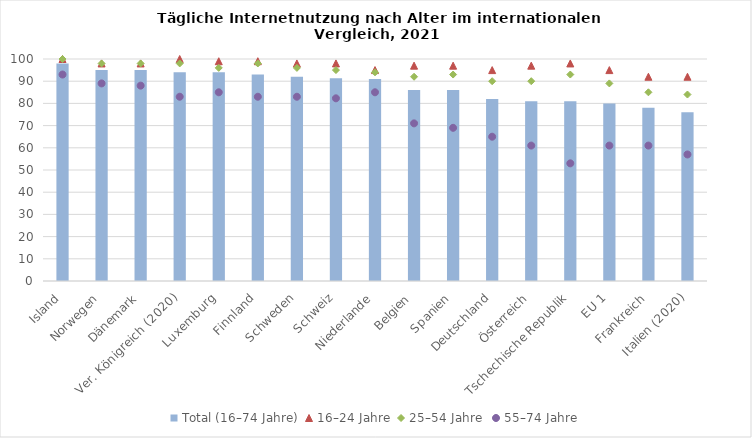
| Category | Total (16–74 Jahre) |
|---|---|
| Island | 98 |
| Norwegen | 95 |
| Dänemark | 95 |
| Ver. Königreich (2020) | 94 |
| Luxemburg | 94 |
| Finnland | 93 |
| Schweden | 92 |
| Schweiz | 91.347 |
| Niederlande | 91 |
| Belgien | 86 |
| Spanien | 86 |
| Deutschland | 82 |
| Österreich | 81 |
| Tschechische Republik | 81 |
| EU 1 | 80 |
| Frankreich | 78 |
| Italien (2020) | 76 |